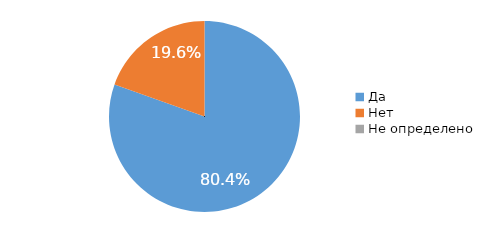
| Category | Series 0 |
|---|---|
| Да | 0.804 |
| Нет | 0.196 |
| Не определено | 0 |